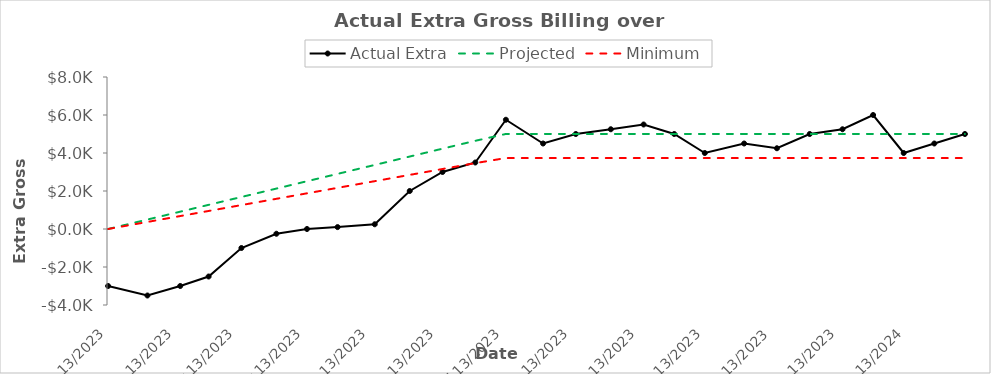
| Category | Actual Extra | Projected | Minimum | Minimum (fixed) | Projected (fixed) |
|---|---|---|---|---|---|
| 2023-01-13 | -3000 | 0 | 0 |  |  |
| 2023-01-31 | -3500 | 497.427 | 371.442 |  |  |
| 2023-02-15 | -3000 | 911.949 | 680.977 |  |  |
| 2023-02-28 | -2500 | 1271.201 | 949.241 |  |  |
| 2023-03-15 | -1000 | 1685.723 | 1258.776 |  |  |
| 2023-03-31 | -250 | 2127.88 | 1588.947 |  |  |
| 2023-04-14 | 0 | 2514.767 | 1877.846 |  |  |
| 2023-04-28 | 100 | 2901.655 | 2166.746 |  |  |
| 2023-05-15 | 250 | 3371.446 | 2517.552 |  |  |
| 2023-05-31 | 2000 | 3813.603 | 2847.723 |  |  |
| 2023-06-15 | 3000 | 4228.125 | 3157.258 |  |  |
| 2023-06-30 | 3500 | 4642.648 | 3466.793 |  |  |
| 2023-07-14 | 5750 | 5001.9 | 3735.057 |  |  |
| 2023-07-31 | 4500 | 5001.9 | 3735.057 |  |  |
| 2023-08-15 | 5000 | 5001.9 | 3735.057 |  |  |
| 2023-08-31 | 5250 | 5001.9 | 3735.057 |  |  |
| 2023-09-15 | 5500 | 5001.9 | 3735.057 |  |  |
| 2023-09-29 | 5000 | 5001.9 | 3735.057 |  |  |
| 2023-10-13 | 4000 | 5001.9 | 3735.057 |  |  |
| 2023-10-31 | 4500 | 5001.9 | 3735.057 |  |  |
| 2023-11-15 | 4250 | 5001.9 | 3735.057 |  |  |
| 2023-11-30 | 5000 | 5001.9 | 3735.057 |  |  |
| 2023-12-15 | 5250 | 5001.9 | 3735.057 |  |  |
| 2023-12-29 | 6000 | 5001.9 | 3735.057 |  |  |
| 2024-01-12 | 4000 | 5001.9 | 3735.057 |  |  |
| 2024-01-26 | 4500 | 5001.9 | 3735.057 |  |  |
| 2024-02-09 | 5000 | 5001.9 | 3735.057 |  |  |